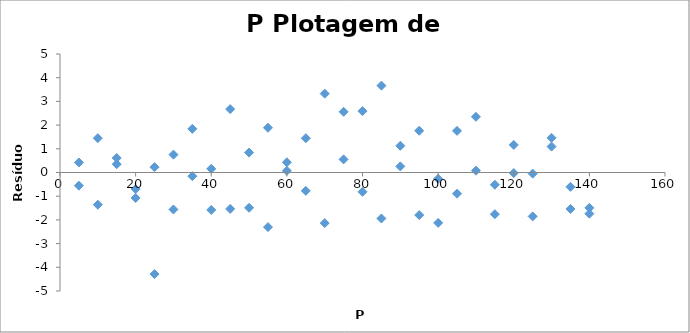
| Category | Series 0 |
|---|---|
| 5.0 | 0.424 |
| 10.0 | -1.36 |
| 15.0 | 0.612 |
| 20.0 | -1.074 |
| 25.0 | 0.224 |
| 30.0 | 0.754 |
| 35.0 | 1.841 |
| 40.0 | 0.158 |
| 45.0 | 2.674 |
| 50.0 | 0.84 |
| 55.0 | 1.889 |
| 60.0 | 0.071 |
| 65.0 | 1.446 |
| 70.0 | 3.327 |
| 75.0 | 2.562 |
| 80.0 | 2.588 |
| 85.0 | 3.665 |
| 90.0 | 1.128 |
| 95.0 | 1.763 |
| 100.0 | -0.265 |
| 105.0 | 1.757 |
| 110.0 | 2.35 |
| 115.0 | -1.758 |
| 120.0 | 1.162 |
| 125.0 | -0.048 |
| 130.0 | 1.094 |
| 135.0 | -0.604 |
| 140.0 | -1.492 |
| 5.0 | -0.555 |
| 10.0 | 1.448 |
| 15.0 | 0.35 |
| 20.0 | -0.697 |
| 25.0 | -4.287 |
| 30.0 | -1.56 |
| 35.0 | -0.155 |
| 40.0 | -1.581 |
| 45.0 | -1.536 |
| 50.0 | -1.49 |
| 55.0 | -2.304 |
| 60.0 | 0.432 |
| 65.0 | -0.774 |
| 70.0 | -2.136 |
| 75.0 | 0.553 |
| 80.0 | -0.813 |
| 85.0 | -1.94 |
| 90.0 | 0.258 |
| 95.0 | -1.795 |
| 100.0 | -2.126 |
| 105.0 | -0.895 |
| 110.0 | 0.078 |
| 115.0 | -0.517 |
| 120.0 | -0.022 |
| 125.0 | -1.852 |
| 130.0 | 1.463 |
| 135.0 | -1.538 |
| 140.0 | -1.738 |